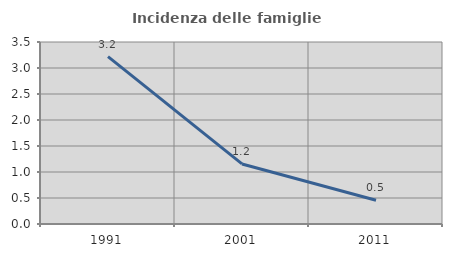
| Category | Incidenza delle famiglie numerose |
|---|---|
| 1991.0 | 3.219 |
| 2001.0 | 1.155 |
| 2011.0 | 0.458 |